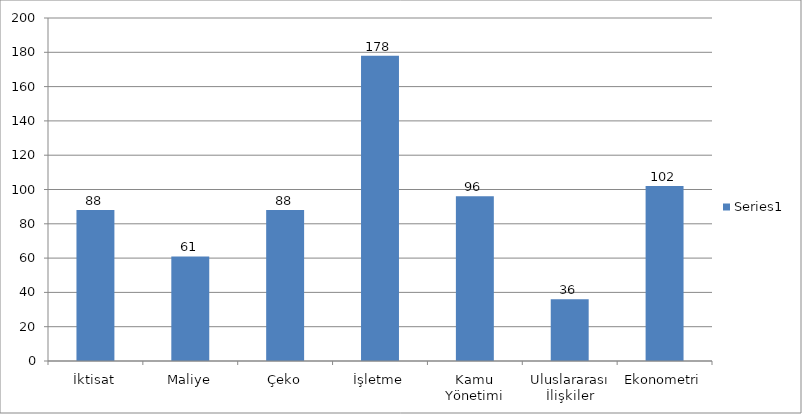
| Category | Series 0 |
|---|---|
| İktisat | 88 |
| Maliye | 61 |
| Çeko | 88 |
| İşletme | 178 |
| Kamu Yönetimi | 96 |
| Uluslararası İlişkiler | 36 |
| Ekonometri | 102 |